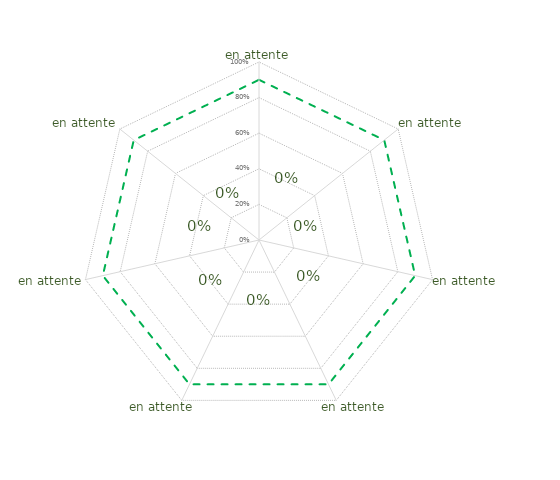
| Category | article 5 | Seuil limite |
|---|---|---|
| 0 | 0 | 0.9 |
| 1 | 0 | 0.9 |
| 2 | 0 | 0.9 |
| 3 | 0 | 0.9 |
| 4 | 0 | 0.9 |
| 5 | 0 | 0.9 |
| 6 | 0 | 0.9 |